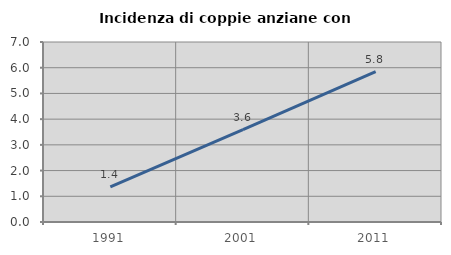
| Category | Incidenza di coppie anziane con figli |
|---|---|
| 1991.0 | 1.37 |
| 2001.0 | 3.591 |
| 2011.0 | 5.848 |